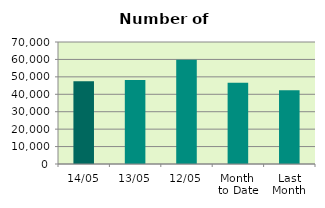
| Category | Series 0 |
|---|---|
| 14/05 | 47490 |
| 13/05 | 48232 |
| 12/05 | 59856 |
| Month 
to Date | 46556.8 |
| Last
Month | 42252.3 |